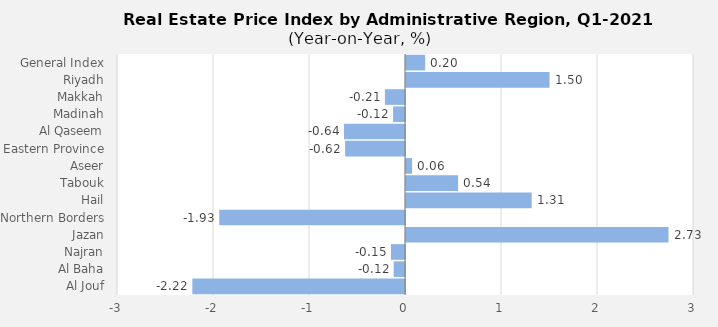
| Category | 2021 |
|---|---|
| General Index | 0.2 |
| Riyadh | 1.495 |
| Makkah | -0.209 |
| Madinah | -0.124 |
| Al Qaseem | -0.635 |
| Eastern Province | -0.624 |
| Aseer | 0.063 |
| Tabouk | 0.543 |
| Hail | 1.309 |
| Northern Borders | -1.935 |
| Jazan | 2.735 |
| Najran | -0.146 |
| Al Baha | -0.118 |
| Al Jouf | -2.215 |